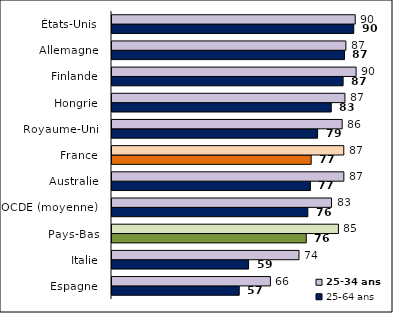
| Category | 25-64 ans | 25-34 ans |
|---|---|---|
| Espagne | 56.618 | 65.586 |
| Italie | 59.307 | 73.81 |
| Pays-Bas | 75.901 | 85.166 |
| OCDE (moyenne) | 76.352 | 83.178 |
| Australie | 77.104 | 86.719 |
| France | 77.319 | 86.698 |
| Royaume-Uni | 79.165 | 86.238 |
| Hongrie | 83.094 | 87.025 |
| Finlande | 86.507 | 90.244 |
| Allemagne | 86.903 | 87.302 |
| États-Unis | 89.57 | 89.991 |